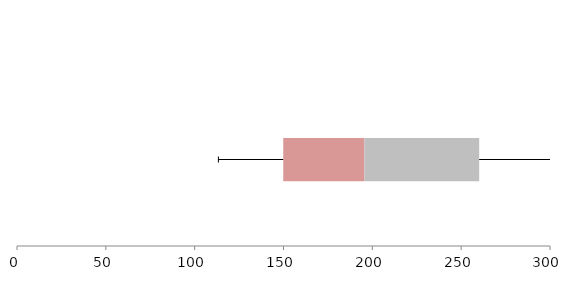
| Category | Series 1 | Series 2 | Series 3 |
|---|---|---|---|
| 0 | 149.854 | 45.705 | 64.589 |